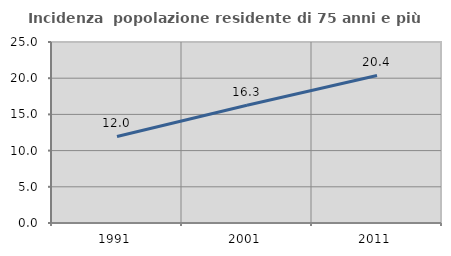
| Category | Incidenza  popolazione residente di 75 anni e più |
|---|---|
| 1991.0 | 11.952 |
| 2001.0 | 16.26 |
| 2011.0 | 20.382 |